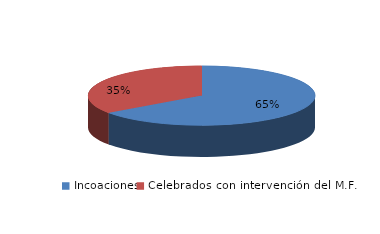
| Category | Series 0 |
|---|---|
| Incoaciones | 1742 |
| Celebrados con intervención del M.F. | 930 |